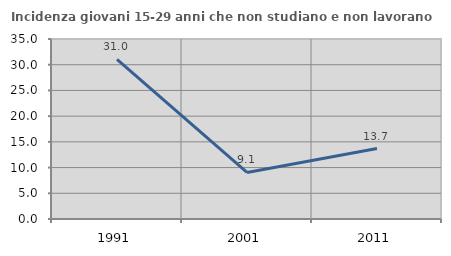
| Category | Incidenza giovani 15-29 anni che non studiano e non lavorano  |
|---|---|
| 1991.0 | 31.034 |
| 2001.0 | 9.059 |
| 2011.0 | 13.692 |